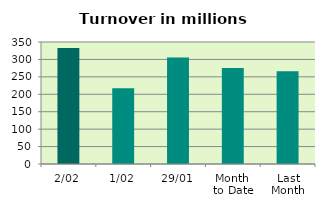
| Category | Series 0 |
|---|---|
| 2/02 | 332.797 |
| 1/02 | 217.466 |
| 29/01 | 305.592 |
| Month 
to Date | 275.131 |
| Last
Month | 265.89 |